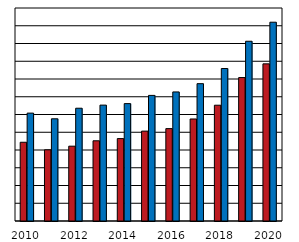
| Category | ženy  Women | muži  Men |
|---|---|---|
| 2010.0 | 10436.202 | 12078.296 |
| 2011.0 | 10010.973 | 11758.548 |
| 2012.0 | 10215.288 | 12353.53 |
| 2013.0 | 10519.157 | 12528.285 |
| 2014.0 | 10643.295 | 12612.75 |
| 2015.0 | 11064 | 13076 |
| 2016.0 | 11205 | 13272 |
| 2017.0 | 11748 | 13737 |
| 2018.0 | 12523 | 14590 |
| 2019.0 | 14081 | 16126 |
| 2020.0 | 14853 | 17199 |